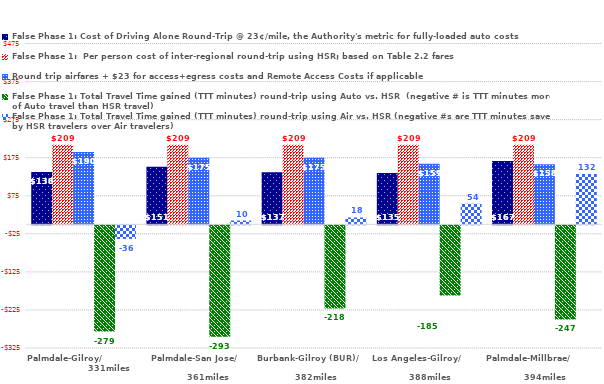
| Category | False Phase 1: Cost of Driving Alone Round-Trip @ 23¢/mile, the Authority's metric for fully-loaded auto costs | False Phase 1:  Per person cost of inter-regional round-trip using HSR; based on Table 2.2 fares | Round trip airfares + $23 for access+egress costs and Remote Access Costs if applicable | False Phase 1: Total Travel Time gained (TTT minutes) round-trip using Auto vs. HSR  (negative # is TTT minutes more of Auto travel than HSR travel) | False Phase 1: Total Travel Time gained (TTT minutes) round-trip using Air vs. HSR (negative #s are TTT minutes saved by HSR travelers over Air travelers) |
|---|---|---|---|---|---|
| Palmdale-Gilroy/                              331miles | 137.54 | 209 | 190 | -279.3 | -36 |
|    Palmdale-San Jose/                                                       361miles | 151.34 | 209 | 175 | -293.1 | 10 |
| Burbank-Gilroy (BUR)/                                                 382miles | 136.62 | 209 | 175 | -218.4 | 18 |
| Los Angeles-Gilroy/                                              388miles | 134.78 | 209 | 159 | -184.7 | 54 |
| Palmdale-Millbrae/                                                    394miles | 166.52 | 209 | 158 | -247.2 | 132 |